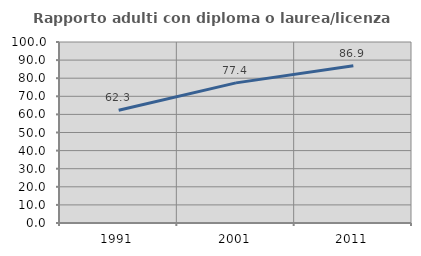
| Category | Rapporto adulti con diploma o laurea/licenza media  |
|---|---|
| 1991.0 | 62.338 |
| 2001.0 | 77.419 |
| 2011.0 | 86.861 |